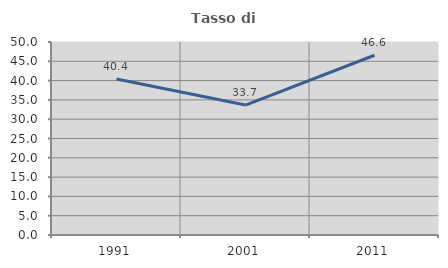
| Category | Tasso di occupazione   |
|---|---|
| 1991.0 | 40.39 |
| 2001.0 | 33.67 |
| 2011.0 | 46.565 |